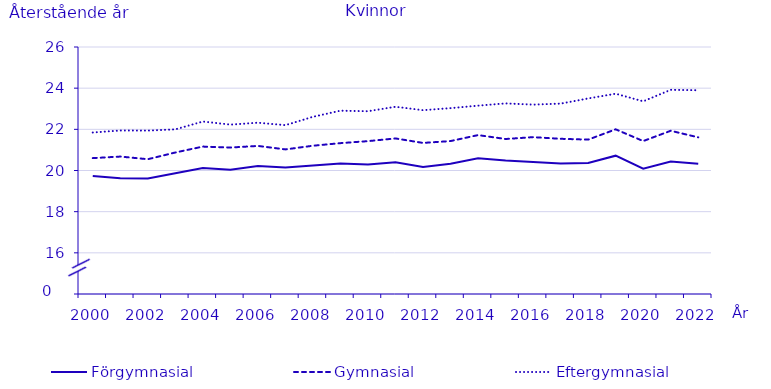
| Category | Förgymnasial | Gymnasial | Eftergymnasial |
|---|---|---|---|
| 2000.0 | 19.737 | 20.601 | 21.846 |
| 2001.0 | 19.624 | 20.677 | 21.944 |
| 2002.0 | 19.609 | 20.548 | 21.939 |
| 2003.0 | 19.865 | 20.875 | 21.999 |
| 2004.0 | 20.123 | 21.162 | 22.379 |
| 2005.0 | 20.042 | 21.115 | 22.229 |
| 2006.0 | 20.22 | 21.194 | 22.322 |
| 2007.0 | 20.147 | 21.025 | 22.203 |
| 2008.0 | 20.24 | 21.203 | 22.608 |
| 2009.0 | 20.336 | 21.329 | 22.906 |
| 2010.0 | 20.295 | 21.427 | 22.88 |
| 2011.0 | 20.401 | 21.557 | 23.097 |
| 2012.0 | 20.17 | 21.34 | 22.93 |
| 2013.0 | 20.33 | 21.43 | 23.03 |
| 2014.0 | 20.59 | 21.72 | 23.15 |
| 2015.0 | 20.48 | 21.53 | 23.26 |
| 2016.0 | 20.41 | 21.62 | 23.2 |
| 2017.0 | 20.34 | 21.54 | 23.25 |
| 2018.0 | 20.37 | 21.5 | 23.5 |
| 2019.0 | 20.72 | 22 | 23.73 |
| 2020.0 | 20.09 | 21.43 | 23.36 |
| 2021.0 | 20.44 | 21.93 | 23.92 |
| 2022.0 | 20.33 | 21.61 | 23.9 |